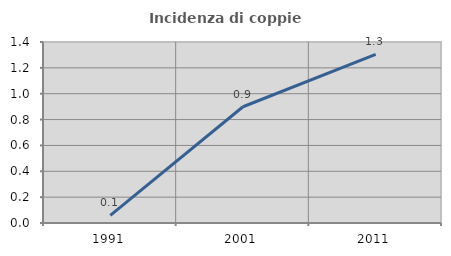
| Category | Incidenza di coppie miste |
|---|---|
| 1991.0 | 0.059 |
| 2001.0 | 0.899 |
| 2011.0 | 1.304 |